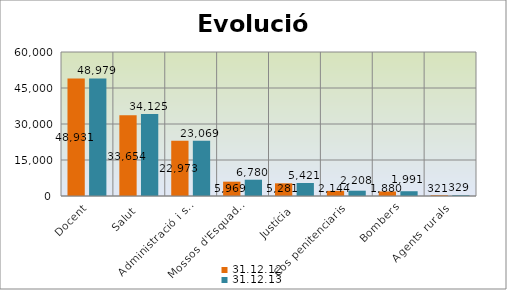
| Category | 31.12.12 | 31.12.13 |
|---|---|---|
| Docent | 48931 | 48979 |
| Salut | 33654 | 34125 |
| Administració i serveis | 22973 | 23069 |
| Mossos d'Esquadra | 5969 | 6780 |
| Justícia | 5281 | 5421 |
| Cos penitenciaris | 2144 | 2208 |
| Bombers | 1880 | 1991 |
| Agents rurals | 321 | 329 |